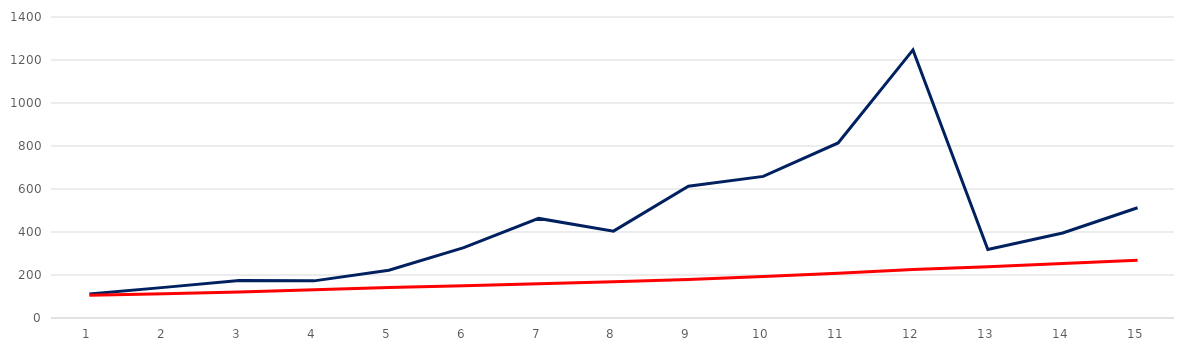
| Category | Series 0 | Series 1 | Series 2 | Series 3 |
|---|---|---|---|---|
| 0 | 112.15 |  |  | 106 |
| 1 | 142.46 |  |  | 112.36 |
| 2 | 174.01 |  |  | 121.349 |
| 3 | 172.71 |  |  | 131.057 |
| 4 | 222.41 |  |  | 141.541 |
| 5 | 327.33 |  |  | 150.034 |
| 6 | 463.16 |  |  | 159.036 |
| 7 | 404.11 |  |  | 168.578 |
| 8 | 612.91 |  |  | 178.693 |
| 9 | 658.7 |  |  | 192.988 |
| 10 | 814.33 |  |  | 208.427 |
| 11 | 1246.84 |  |  | 225.101 |
| 12 | 318.61 |  |  | 238.607 |
| 13 | 395.67 |  |  | 252.924 |
| 14 | 513 |  |  | 268.099 |